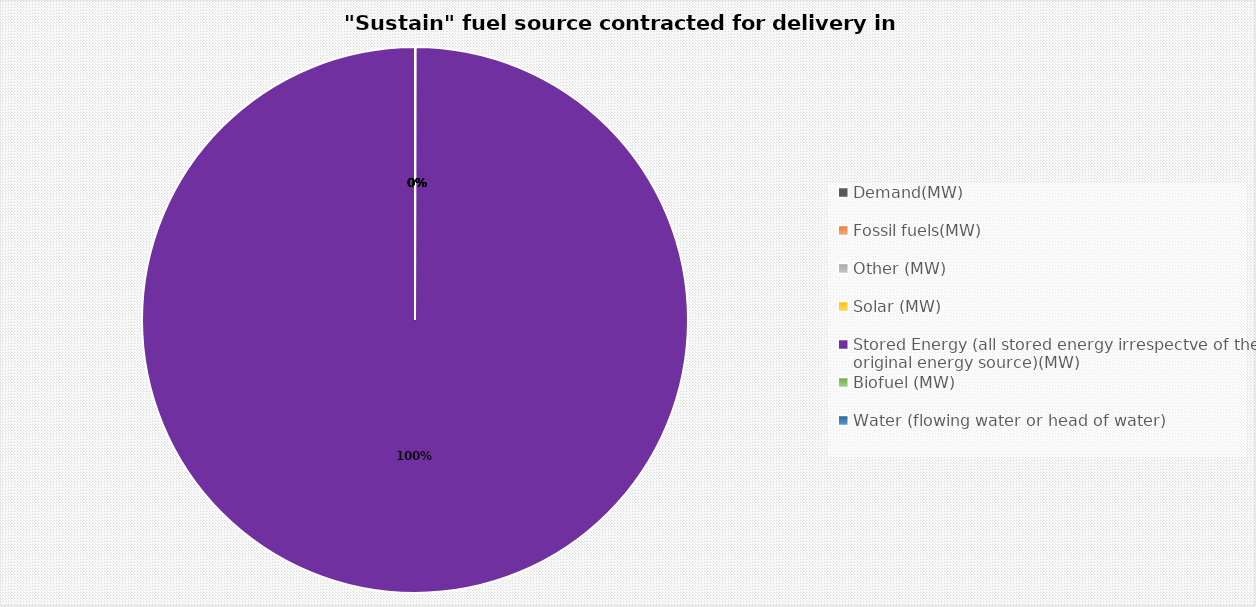
| Category | Sustain fuel source contracted for delivery in 22/23 |
|---|---|
| Demand(MW) | 0 |
| Fossil fuels(MW) | 0 |
| Other (MW) | 0 |
| Solar (MW) | 0 |
| Stored Energy (all stored energy irrespectve of the original energy source)(MW) | 13.485 |
| Biofuel (MW) | 0 |
| Water (flowing water or head of water) | 0 |